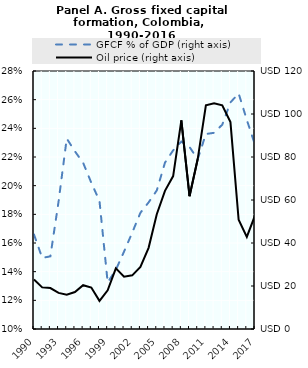
| Category | GFCF % of GDP (right axis) |
|---|---|
| 1990.0 | 0.166 |
| 1991.0 | 0.15 |
| 1992.0 | 0.151 |
| 1993.0 | 0.189 |
| 1994.0 | 0.233 |
| 1995.0 | 0.224 |
| 1996.0 | 0.216 |
| 1997.0 | 0.202 |
| 1998.0 | 0.189 |
| 1999.0 | 0.132 |
| 2000.0 | 0.141 |
| 2001.0 | 0.154 |
| 2002.0 | 0.167 |
| 2003.0 | 0.181 |
| 2004.0 | 0.188 |
| 2005.0 | 0.197 |
| 2006.0 | 0.216 |
| 2007.0 | 0.225 |
| 2008.0 | 0.231 |
| 2009.0 | 0.227 |
| 2010.0 | 0.219 |
| 2011.0 | 0.236 |
| 2012.0 | 0.237 |
| 2013.0 | 0.243 |
| 2014.0 | 0.258 |
| 2015.0 | 0.264 |
| 2016.0 | 0.246 |
| 2017.0 | 0.229 |